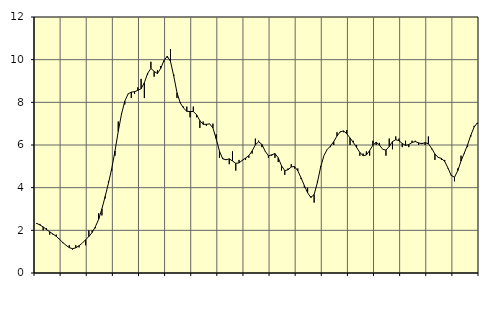
| Category | Piggar | Series 1 |
|---|---|---|
| nan | 2.3 | 2.33 |
| 87.0 | 2.3 | 2.25 |
| 87.0 | 2 | 2.16 |
| 87.0 | 2.1 | 2.04 |
| nan | 1.8 | 1.93 |
| 88.0 | 1.8 | 1.83 |
| 88.0 | 1.8 | 1.72 |
| 88.0 | 1.6 | 1.58 |
| nan | 1.4 | 1.43 |
| 89.0 | 1.3 | 1.3 |
| 89.0 | 1.3 | 1.19 |
| 89.0 | 1.1 | 1.14 |
| nan | 1.3 | 1.18 |
| 90.0 | 1.2 | 1.28 |
| 90.0 | 1.4 | 1.4 |
| 90.0 | 1.3 | 1.56 |
| nan | 2 | 1.71 |
| 91.0 | 2 | 1.9 |
| 91.0 | 2.1 | 2.17 |
| 91.0 | 2.8 | 2.52 |
| nan | 2.7 | 3.01 |
| 92.0 | 3.5 | 3.59 |
| 92.0 | 4.3 | 4.21 |
| 92.0 | 4.8 | 4.89 |
| nan | 5.5 | 5.72 |
| 93.0 | 7.1 | 6.64 |
| 93.0 | 7.5 | 7.45 |
| 93.0 | 7.9 | 8.05 |
| nan | 8.4 | 8.39 |
| 94.0 | 8.2 | 8.48 |
| 94.0 | 8.4 | 8.5 |
| 94.0 | 8.7 | 8.56 |
| nan | 9.1 | 8.64 |
| 95.0 | 8.2 | 8.92 |
| 95.0 | 9.3 | 9.36 |
| 95.0 | 9.9 | 9.59 |
| nan | 9.2 | 9.45 |
| 96.0 | 9.5 | 9.35 |
| 96.0 | 9.7 | 9.59 |
| 96.0 | 9.9 | 9.96 |
| nan | 10.1 | 10.16 |
| 97.0 | 10.5 | 9.92 |
| 97.0 | 9.3 | 9.23 |
| 97.0 | 8.2 | 8.45 |
| nan | 8 | 7.97 |
| 98.0 | 7.8 | 7.73 |
| 98.0 | 7.8 | 7.58 |
| 98.0 | 7.3 | 7.57 |
| nan | 7.8 | 7.57 |
| 99.0 | 7.3 | 7.42 |
| 99.0 | 6.8 | 7.14 |
| 99.0 | 7.1 | 6.97 |
| nan | 6.9 | 6.97 |
| 0.0 | 7 | 6.99 |
| 0.0 | 7 | 6.8 |
| 0.0 | 6.5 | 6.29 |
| nan | 5.4 | 5.71 |
| 1.0 | 5.4 | 5.35 |
| 1.0 | 5.3 | 5.31 |
| 1.0 | 5.1 | 5.35 |
| nan | 5.7 | 5.25 |
| 2.0 | 4.8 | 5.14 |
| 2.0 | 5.3 | 5.16 |
| 2.0 | 5.3 | 5.28 |
| nan | 5.3 | 5.39 |
| 3.0 | 5.4 | 5.5 |
| 3.0 | 5.6 | 5.72 |
| 3.0 | 6.3 | 6.01 |
| nan | 6.2 | 6.15 |
| 4.0 | 5.9 | 6.03 |
| 4.0 | 5.7 | 5.71 |
| 4.0 | 5.4 | 5.49 |
| nan | 5.5 | 5.54 |
| 5.0 | 5.4 | 5.6 |
| 5.0 | 5.2 | 5.4 |
| 5.0 | 4.8 | 5.03 |
| nan | 4.6 | 4.8 |
| 6.0 | 4.9 | 4.84 |
| 6.0 | 5.1 | 4.97 |
| 6.0 | 4.9 | 4.99 |
| nan | 4.9 | 4.79 |
| 7.0 | 4.4 | 4.46 |
| 7.0 | 4 | 4.1 |
| 7.0 | 4 | 3.76 |
| nan | 3.6 | 3.54 |
| 8.0 | 3.3 | 3.68 |
| 8.0 | 4.3 | 4.24 |
| 8.0 | 5 | 4.97 |
| nan | 5.5 | 5.5 |
| 9.0 | 5.8 | 5.79 |
| 9.0 | 5.9 | 5.95 |
| 9.0 | 6 | 6.16 |
| nan | 6.6 | 6.42 |
| 10.0 | 6.6 | 6.62 |
| 10.0 | 6.6 | 6.66 |
| 10.0 | 6.7 | 6.53 |
| nan | 6 | 6.33 |
| 11.0 | 6.2 | 6.12 |
| 11.0 | 6 | 5.89 |
| 11.0 | 5.5 | 5.65 |
| nan | 5.6 | 5.5 |
| 12.0 | 5.7 | 5.53 |
| 12.0 | 5.5 | 5.74 |
| 12.0 | 6.2 | 5.99 |
| nan | 6 | 6.13 |
| 13.0 | 6.1 | 6 |
| 13.0 | 5.8 | 5.8 |
| 13.0 | 5.5 | 5.76 |
| nan | 6.3 | 5.93 |
| 14.0 | 5.8 | 6.16 |
| 14.0 | 6.4 | 6.25 |
| 14.0 | 6.3 | 6.2 |
| nan | 5.9 | 6.07 |
| 15.0 | 6.2 | 5.98 |
| 15.0 | 5.9 | 6.02 |
| 15.0 | 6.2 | 6.12 |
| nan | 6.2 | 6.16 |
| 16.0 | 6 | 6.1 |
| 16.0 | 6.1 | 6.06 |
| 16.0 | 6 | 6.11 |
| nan | 6.4 | 6.06 |
| 17.0 | 5.8 | 5.84 |
| 17.0 | 5.3 | 5.58 |
| 17.0 | 5.4 | 5.42 |
| nan | 5.3 | 5.37 |
| 18.0 | 5.3 | 5.23 |
| 18.0 | 4.9 | 4.92 |
| 18.0 | 4.6 | 4.57 |
| nan | 4.3 | 4.49 |
| 19.0 | 4.9 | 4.8 |
| 19.0 | 5.5 | 5.25 |
| 19.0 | 5.6 | 5.62 |
| nan | 5.9 | 6.01 |
| 20.0 | 6.4 | 6.46 |
| 20.0 | 6.9 | 6.84 |
| 20.0 | 7 | 7.04 |